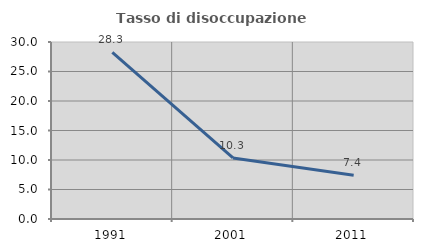
| Category | Tasso di disoccupazione giovanile  |
|---|---|
| 1991.0 | 28.261 |
| 2001.0 | 10.345 |
| 2011.0 | 7.407 |